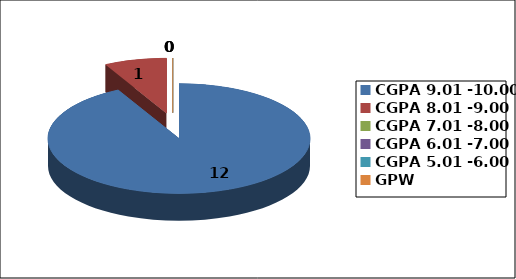
| Category | Series 0 |
|---|---|
| CGPA 9.01 -10.00 | 12 |
| CGPA 8.01 -9.00 | 1 |
| CGPA 7.01 -8.00 | 0 |
| CGPA 6.01 -7.00 | 0 |
| CGPA 5.01 -6.00 | 0 |
| GPW | 0 |